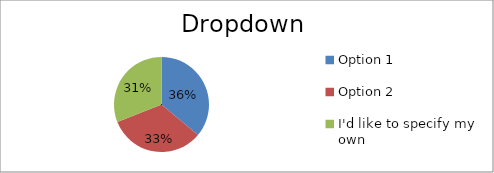
| Category | Options |
|---|---|
| Option 1 | 57 |
| Option 2 | 52 |
| I'd like to specify my own | 49 |